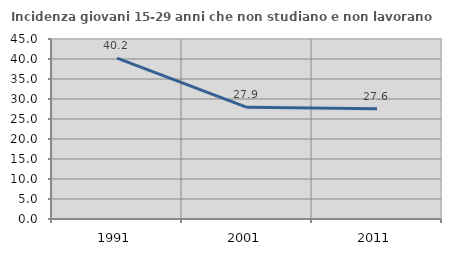
| Category | Incidenza giovani 15-29 anni che non studiano e non lavorano  |
|---|---|
| 1991.0 | 40.201 |
| 2001.0 | 27.907 |
| 2011.0 | 27.551 |